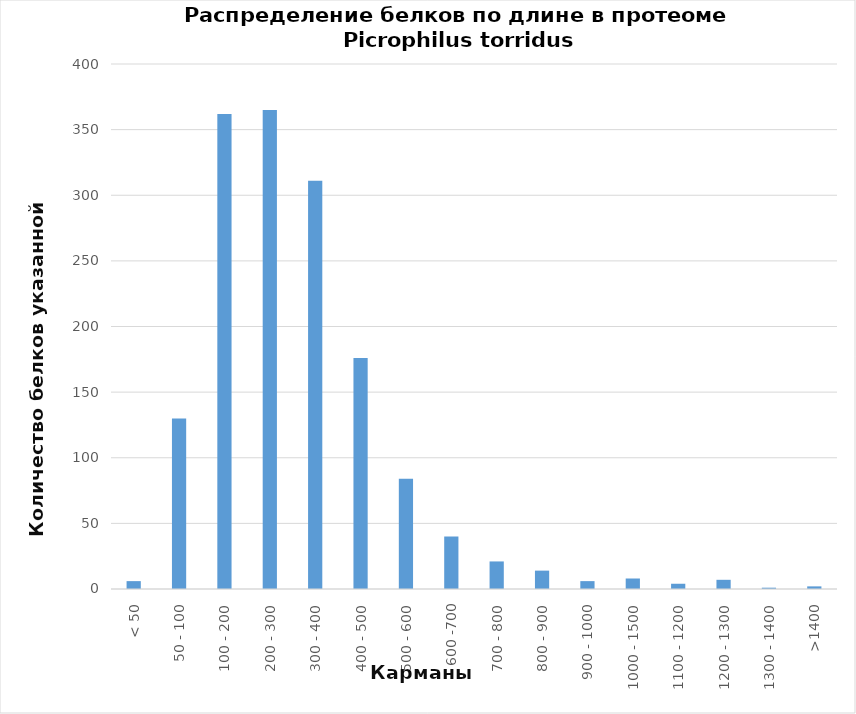
| Category | Series 0 |
|---|---|
| < 50 | 6 |
| 50 - 100 | 130 |
| 100 - 200 | 362 |
| 200 - 300 | 365 |
| 300 - 400 | 311 |
| 400 - 500 | 176 |
| 500 - 600 | 84 |
| 600 -700 | 40 |
| 700 - 800 | 21 |
| 800 - 900 | 14 |
| 900 - 1000 | 6 |
| 1000 - 1500 | 8 |
| 1100 - 1200 | 4 |
| 1200 - 1300 | 7 |
| 1300 - 1400 | 1 |
| >1400 | 2 |